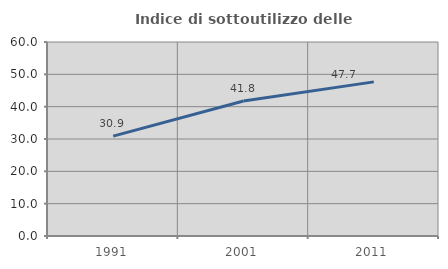
| Category | Indice di sottoutilizzo delle abitazioni  |
|---|---|
| 1991.0 | 30.876 |
| 2001.0 | 41.773 |
| 2011.0 | 47.666 |